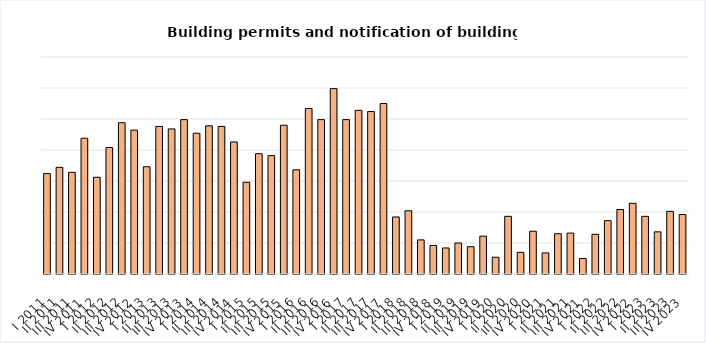
| Category | Building permits and notification of building work |
|---|---|
| I 2011 | 162 |
| II 2011 | 172 |
| III 2011 | 164 |
| IV 2011 | 219 |
| I 2012 | 156 |
| II 2012 | 204 |
| III 2012 | 244 |
| IV 2012 | 232 |
| I 2013 | 173 |
| II 2013 | 238 |
| III 2013 | 234 |
| IV 2013 | 249 |
| I 2014 | 227 |
| II 2014 | 239 |
| III 2014 | 238 |
| IV 2014 | 213 |
| I 2015 | 148 |
| II 2015 | 194 |
| III 2015 | 191 |
| IV 2015 | 240 |
| I 2016 | 168 |
| II 2016 | 267 |
| III 2016 | 249 |
| IV 2016 | 299 |
| I 2017 | 249 |
| II 2017 | 264 |
| III 2017 | 262 |
| IV 2017 | 275 |
| I 2018 | 92 |
| II 2018 | 102 |
| III 2018 | 55 |
| IV 2018 | 46 |
| I 2019 | 42 |
| II 2019 | 50 |
| III 2019 | 44 |
| IV 2019 | 61 |
| I 2020 | 27 |
| II 2020 | 93 |
| III 2020 | 35 |
| IV 2020 | 69 |
| I 2021 | 34 |
| II 2021 | 65 |
| III 2021 | 66 |
| IV 2021 | 25 |
| I 2022 | 64 |
| II 2022 | 86 |
| III 2022 | 104 |
| IV 2022 | 114 |
| I 2023 | 93 |
| II 2023 | 68 |
| III 2023 | 101 |
| IV 2023 | 96 |